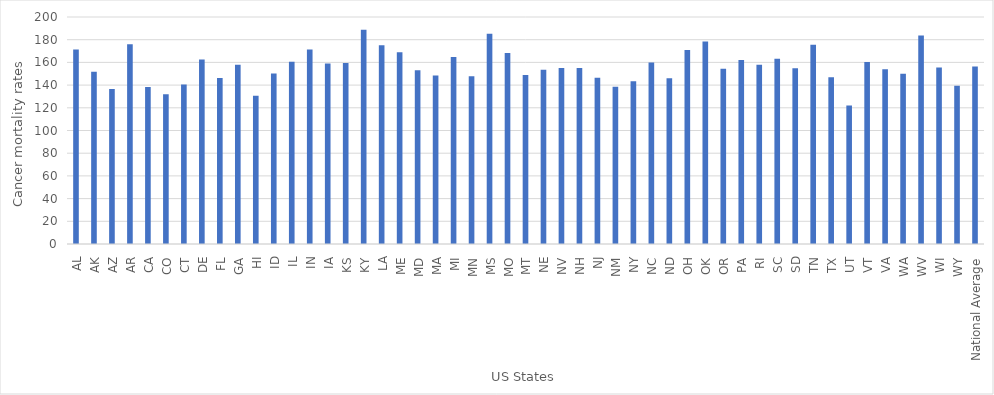
| Category | Averages |
|---|---|
| AL | 171.4 |
| AK | 151.717 |
| AZ | 136.6 |
| AR | 175.9 |
| CA | 138.317 |
| CO | 131.983 |
| CT | 140.55 |
| DE | 162.567 |
| FL | 146.183 |
| GA | 157.9 |
| HI | 130.567 |
| ID | 150.117 |
| IL | 160.55 |
| IN | 171.267 |
| IA | 159.017 |
| KS | 159.567 |
| KY | 188.7 |
| LA | 175.033 |
| ME | 169.05 |
| MD | 153.167 |
| MA | 148.433 |
| MI | 164.667 |
| MN | 147.717 |
| MS | 185.183 |
| MO | 168.383 |
| MT | 148.883 |
| NE | 153.583 |
| NV | 154.967 |
| NH | 155.067 |
| NJ | 146.5 |
| NM | 138.517 |
| NY | 143.333 |
| NC | 159.817 |
| ND | 146.067 |
| OH | 170.95 |
| OK | 178.4 |
| OR | 154.35 |
| PA | 162.1 |
| RI | 157.917 |
| SC | 163.283 |
| SD | 154.933 |
| TN | 175.5 |
| TX | 146.9 |
| UT | 122.083 |
| VT | 160.417 |
| VA | 153.983 |
| WA | 149.983 |
| WV | 183.6 |
| WI | 155.567 |
| WY | 139.433 |
| National Average | 156.413 |